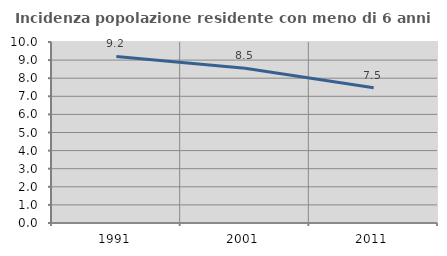
| Category | Incidenza popolazione residente con meno di 6 anni |
|---|---|
| 1991.0 | 9.201 |
| 2001.0 | 8.545 |
| 2011.0 | 7.469 |